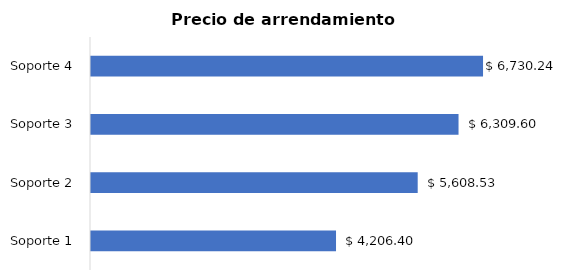
| Category | TOTAL                           MENSUAL  (Lineal) |
|---|---|
| Soporte 1 | 4206.398 |
| Soporte 2 | 5608.53 |
| Soporte 3 | 6309.597 |
| Soporte 4 | 6730.236 |